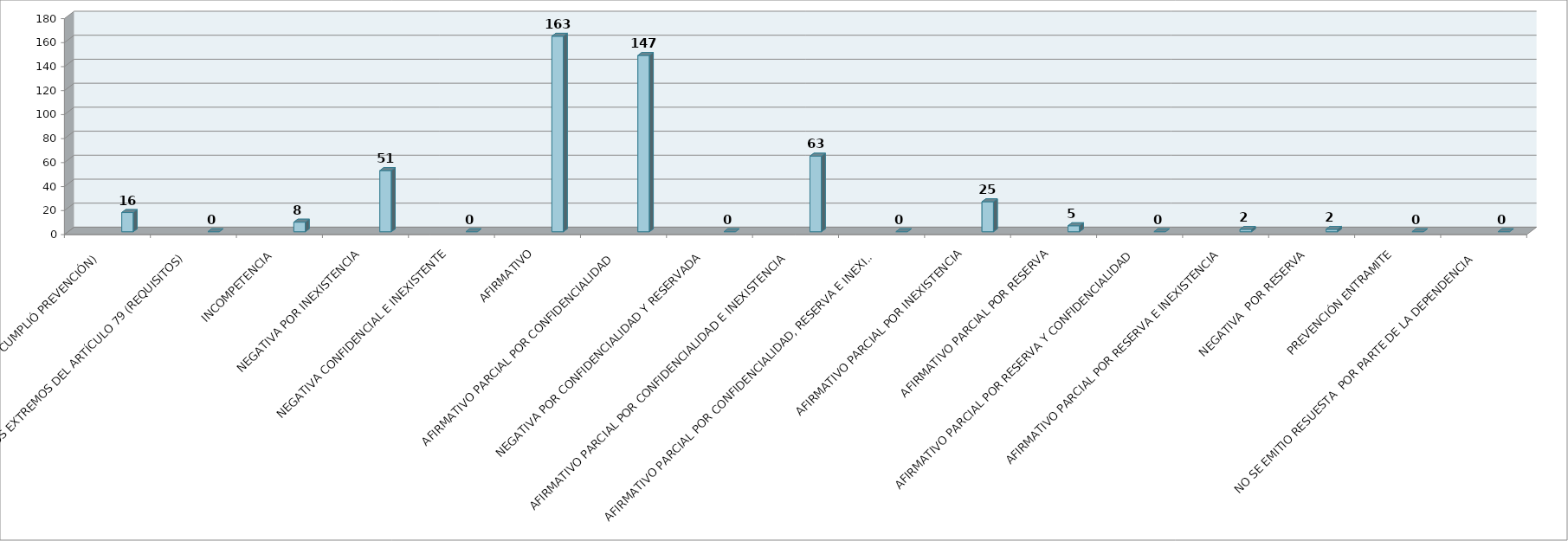
| Category | Series 0 | Series 1 | Series 2 | Series 3 | Series 4 | Series 5 |
|---|---|---|---|---|---|---|
| SE TIENE POR NO PRESENTADA ( NO CUMPLIÓ PREVENCIÓN) |  |  |  |  | 16 |  |
| NO CUMPLIO CON LOS EXTREMOS DEL ARTÍCULO 79 (REQUISITOS) |  |  |  |  | 0 |  |
| INCOMPETENCIA  |  |  |  |  | 8 |  |
| NEGATIVA POR INEXISTENCIA |  |  |  |  | 51 |  |
| NEGATIVA CONFIDENCIAL E INEXISTENTE |  |  |  |  | 0 |  |
| AFIRMATIVO |  |  |  |  | 163 |  |
| AFIRMATIVO PARCIAL POR CONFIDENCIALIDAD  |  |  |  |  | 147 |  |
| NEGATIVA POR CONFIDENCIALIDAD Y RESERVADA |  |  |  |  | 0 |  |
| AFIRMATIVO PARCIAL POR CONFIDENCIALIDAD E INEXISTENCIA |  |  |  |  | 63 |  |
| AFIRMATIVO PARCIAL POR CONFIDENCIALIDAD, RESERVA E INEXISTENCIA |  |  |  |  | 0 |  |
| AFIRMATIVO PARCIAL POR INEXISTENCIA |  |  |  |  | 25 |  |
| AFIRMATIVO PARCIAL POR RESERVA |  |  |  |  | 5 |  |
| AFIRMATIVO PARCIAL POR RESERVA Y CONFIDENCIALIDAD |  |  |  |  | 0 |  |
| AFIRMATIVO PARCIAL POR RESERVA E INEXISTENCIA |  |  |  |  | 2 |  |
| NEGATIVA  POR RESERVA |  |  |  |  | 2 |  |
| PREVENCIÓN ENTRAMITE |  |  |  |  | 0 |  |
| NO SE EMITIO RESUESTA  POR PARTE DE LA DEPENDENCIA |  |  |  |  | 0 |  |